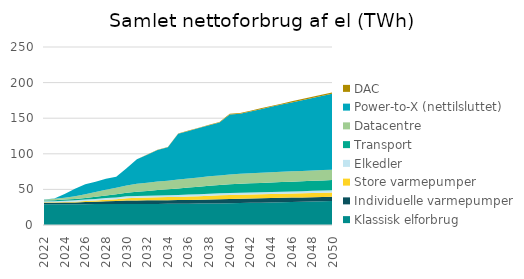
| Category | Klassisk elforbrug | Individuelle varmepumper | Store varmepumper | Elkedler | Transport | Datacentre | Power-to-X (nettilsluttet) | DAC |
|---|---|---|---|---|---|---|---|---|
| 2022.0 | 29.185 | 2.078 | 0.623 | 1.304 | 1.085 | 1.306 | 0.16 | 0 |
| 2023.0 | 29.176 | 2.233 | 0.677 | 1.356 | 1.357 | 1.912 | 0.63 | 0 |
| 2024.0 | 29.168 | 2.389 | 0.86 | 1.695 | 1.673 | 2.627 | 5.26 | 0 |
| 2025.0 | 29.159 | 2.544 | 0.986 | 1.946 | 1.944 | 3.945 | 10.448 | 0 |
| 2026.0 | 29.254 | 2.983 | 1.311 | 2.178 | 2.286 | 5.245 | 13.888 | 0 |
| 2027.0 | 29.348 | 3.421 | 1.548 | 2.331 | 2.868 | 6.753 | 14.488 | 0 |
| 2028.0 | 29.443 | 3.86 | 2.129 | 2.418 | 3.548 | 8.03 | 15.362 | 0 |
| 2029.0 | 29.537 | 4.299 | 2.489 | 2.456 | 4.242 | 9.284 | 15.362 | 0 |
| 2030.0 | 29.632 | 4.737 | 3.246 | 2.641 | 5.031 | 10.188 | 24.37 | 0 |
| 2031.0 | 29.642 | 4.846 | 3.745 | 2.671 | 5.83 | 11.169 | 34.37 | 0.088 |
| 2032.0 | 29.653 | 4.954 | 3.873 | 2.696 | 6.599 | 11.667 | 39.37 | 0.175 |
| 2033.0 | 29.664 | 5.063 | 4.149 | 2.71 | 7.397 | 11.938 | 44.37 | 0.262 |
| 2034.0 | 29.675 | 5.171 | 4.317 | 2.736 | 8.215 | 12.209 | 46.87 | 0.35 |
| 2035.0 | 29.685 | 5.279 | 4.501 | 2.748 | 9.041 | 12.48 | 64.37 | 0.438 |
| 2036.0 | 29.856 | 5.426 | 4.723 | 2.752 | 9.831 | 12.729 | 66.87 | 0.525 |
| 2037.0 | 30.027 | 5.573 | 4.878 | 2.755 | 10.546 | 12.979 | 69.37 | 0.612 |
| 2038.0 | 30.198 | 5.72 | 5.207 | 2.789 | 11.191 | 13.222 | 71.87 | 0.7 |
| 2039.0 | 30.368 | 5.867 | 5.39 | 2.794 | 11.774 | 13.466 | 74.37 | 0.788 |
| 2040.0 | 30.539 | 6.014 | 5.635 | 2.797 | 12.216 | 13.709 | 84.37 | 0.875 |
| 2041.0 | 30.827 | 6.041 | 5.682 | 2.799 | 12.535 | 13.953 | 84.37 | 0.975 |
| 2042.0 | 31.114 | 6.068 | 5.721 | 2.8 | 12.807 | 14.095 | 86.87 | 1.075 |
| 2043.0 | 31.402 | 6.094 | 5.767 | 2.801 | 13.057 | 14.238 | 89.37 | 1.175 |
| 2044.0 | 31.69 | 6.121 | 5.807 | 2.814 | 13.285 | 14.38 | 91.87 | 1.275 |
| 2045.0 | 31.977 | 6.148 | 5.843 | 2.82 | 13.493 | 14.435 | 94.37 | 1.375 |
| 2046.0 | 32.312 | 6.137 | 5.873 | 2.82 | 13.72 | 14.49 | 96.87 | 1.475 |
| 2047.0 | 32.647 | 6.127 | 5.945 | 2.845 | 13.928 | 14.49 | 99.37 | 1.575 |
| 2048.0 | 32.982 | 6.116 | 5.994 | 2.845 | 14.122 | 14.49 | 101.87 | 1.675 |
| 2049.0 | 33.317 | 6.106 | 6.03 | 2.846 | 14.305 | 14.49 | 104.37 | 1.775 |
| 2050.0 | 33.652 | 6.095 | 6.075 | 2.848 | 14.477 | 14.49 | 106.87 | 1.875 |